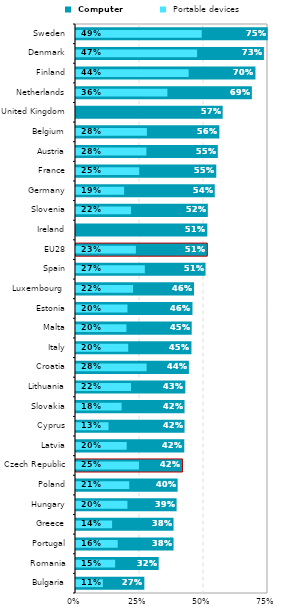
| Category |  Computer |
|---|---|
| Bulgaria | 0.267 |
| Romania | 0.323 |
| Portugal | 0.381 |
| Greece | 0.381 |
| Hungary | 0.393 |
| Poland | 0.397 |
| Czech Republic | 0.416 |
| Latvia | 0.423 |
| Cyprus | 0.424 |
| Slovakia | 0.424 |
| Lithuania | 0.427 |
| Croatia | 0.441 |
| Italy | 0.451 |
| Malta | 0.452 |
| Estonia | 0.455 |
| Luxembourg  | 0.461 |
| Spain | 0.506 |
| EU28 | 0.513 |
| Ireland | 0.513 |
| Slovenia | 0.515 |
| Germany | 0.542 |
| France | 0.548 |
| Austria | 0.554 |
| Belgium | 0.56 |
| United Kingdom | 0.573 |
| Netherlands | 0.687 |
| Finland | 0.701 |
| Denmark | 0.734 |
| Sweden | 0.749 |